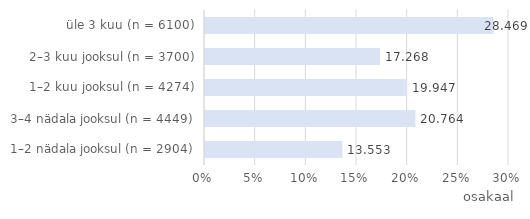
| Category | Series 0 |
|---|---|
| 1–2 nädala jooksul (n = 2904) | 13.553 |
| 3–4 nädala jooksul (n = 4449) | 20.764 |
| 1–2 kuu jooksul (n = 4274) | 19.947 |
| 2–3 kuu jooksul (n = 3700) | 17.268 |
| üle 3 kuu (n = 6100) | 28.469 |